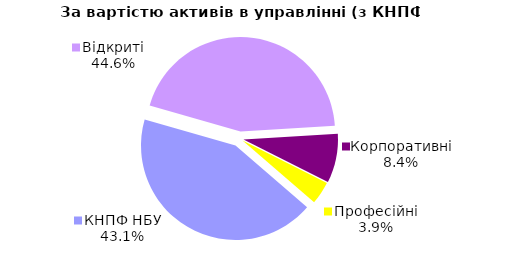
| Category | Series 0 |
|---|---|
| Відкриті | 1908.665 |
| Корпоративні | 360.012 |
| Професійні | 166.895 |
| КНПФ НБУ | 1846.663 |